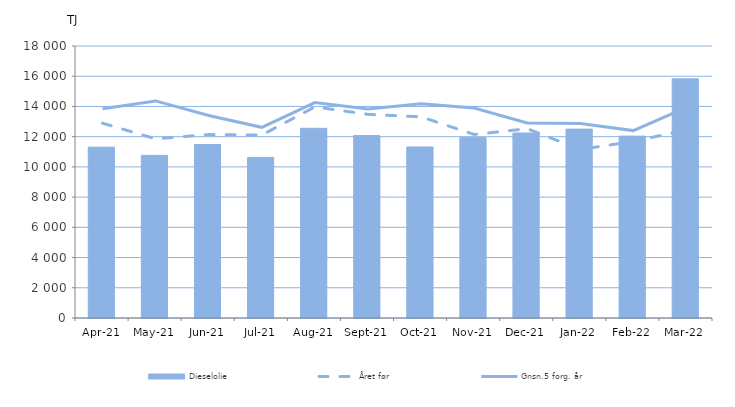
| Category | Dieselolie |
|---|---|
| 2021-04-01 | 11307.53 |
| 2021-05-01 | 10764.704 |
| 2021-06-01 | 11482.387 |
| 2021-07-01 | 10629.589 |
| 2021-08-01 | 12553.764 |
| 2021-09-01 | 12073.025 |
| 2021-10-01 | 11318.506 |
| 2021-11-01 | 11934.898 |
| 2021-12-01 | 12243.183 |
| 2022-01-01 | 12499.137 |
| 2022-02-01 | 12035.794 |
| 2022-03-01 | 15827.544 |